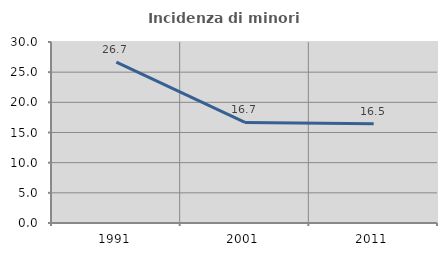
| Category | Incidenza di minori stranieri |
|---|---|
| 1991.0 | 26.667 |
| 2001.0 | 16.667 |
| 2011.0 | 16.456 |